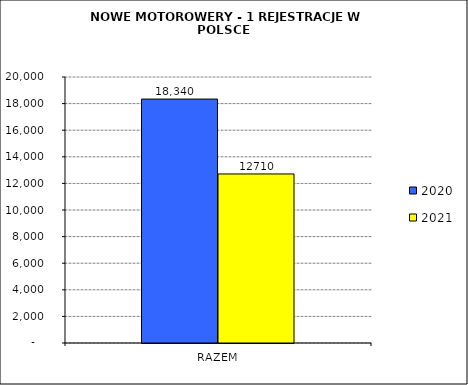
| Category | 2020 | 2021 |
|---|---|---|
| RAZEM | 18340 | 12710 |